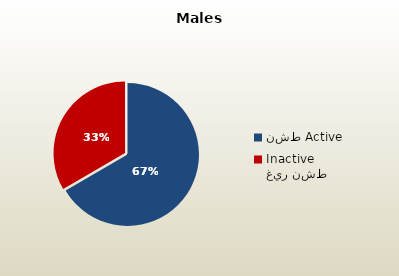
| Category | الذكور القطريين  Qatari Males |
|---|---|
| نشط Active | 70056 |
| غير نشط Inactive | 35091 |